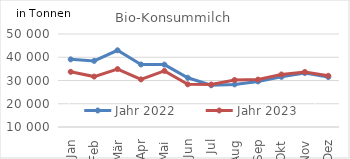
| Category | Jahr 2022 | Jahr 2023 |
|---|---|---|
| 0 | 39095.31 | 33734.133 |
| 1 | 38441.699 | 31681.877 |
| 2 | 42996.417 | 34911.163 |
| 3 | 36894.167 | 30470.977 |
| 4 | 36833.467 | 34117.091 |
| 5 | 31176.555 | 28349.864 |
| 6 | 27947.746 | 28253.396 |
| 7 | 28330.42 | 30228.111 |
| 8 | 29601.874 | 30394.549 |
| 9 | 31563.792 | 32591.68 |
| 10 | 33212.237 | 33665.654 |
| 11 | 31483.37 | 32025.302 |